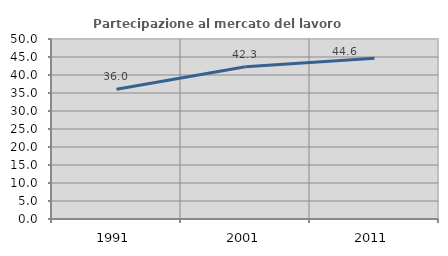
| Category | Partecipazione al mercato del lavoro  femminile |
|---|---|
| 1991.0 | 36.016 |
| 2001.0 | 42.308 |
| 2011.0 | 44.636 |